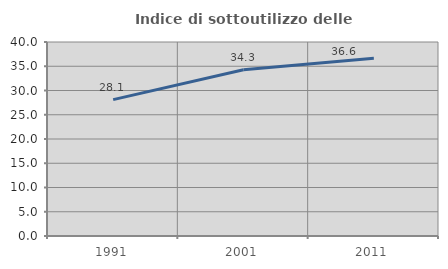
| Category | Indice di sottoutilizzo delle abitazioni  |
|---|---|
| 1991.0 | 28.115 |
| 2001.0 | 34.277 |
| 2011.0 | 36.649 |